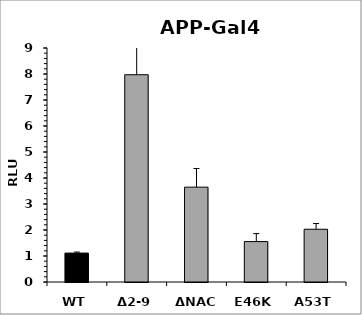
| Category | Series 0 |
|---|---|
| WT | 1.112 |
| Δ2-9 | 7.972 |
| ΔNAC | 3.648 |
| E46K | 1.555 |
| A53T | 2.028 |